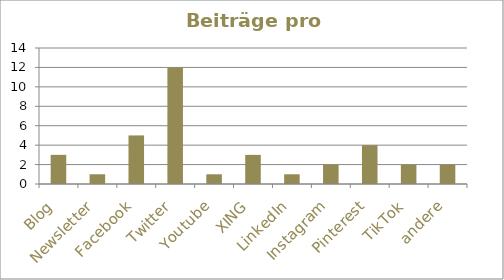
| Category | Beiträge |
|---|---|
| Blog | 3 |
| Newsletter | 1 |
| Facebook | 5 |
| Twitter | 12 |
| Youtube | 1 |
| XING | 3 |
| LinkedIn | 1 |
| Instagram | 2 |
| Pinterest | 4 |
| TikTok | 2 |
| andere | 2 |